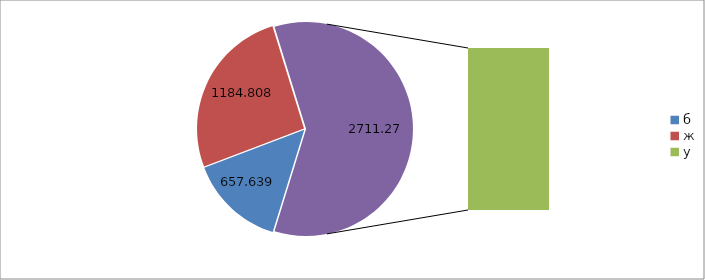
| Category | Series 0 |
|---|---|
| б | 657.639 |
| ж | 1184.808 |
| у | 2711.27 |